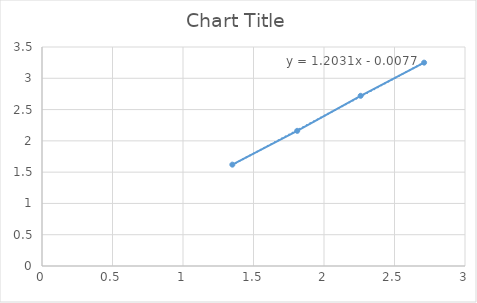
| Category | Series 0 |
|---|---|
| 1.35 | 1.62 |
| 1.81 | 2.16 |
| 2.26 | 2.72 |
| 2.71 | 3.25 |